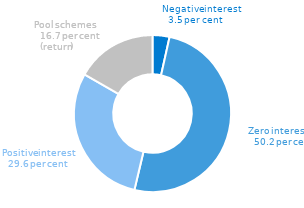
| Category | Share of total deposits |
|---|---|
| Negative interest rate | 3.5 |
| Zero interest rate | 50.2 |
| Positive interest rate | 29.6 |
| Pool schemes (return on investment) | 16.7 |